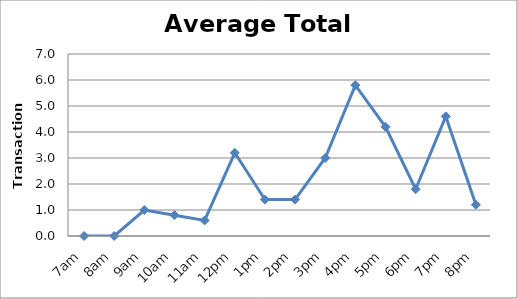
| Category | Transactions |
|---|---|
| 7am | 0 |
| 8am | 0 |
| 9am | 1 |
| 10am | 0.8 |
| 11am | 0.6 |
| 12pm | 3.2 |
| 1pm | 1.4 |
| 2pm | 1.4 |
| 3pm | 3 |
| 4pm | 5.8 |
| 5pm | 4.2 |
| 6pm | 1.8 |
| 7pm | 4.6 |
| 8pm | 1.2 |